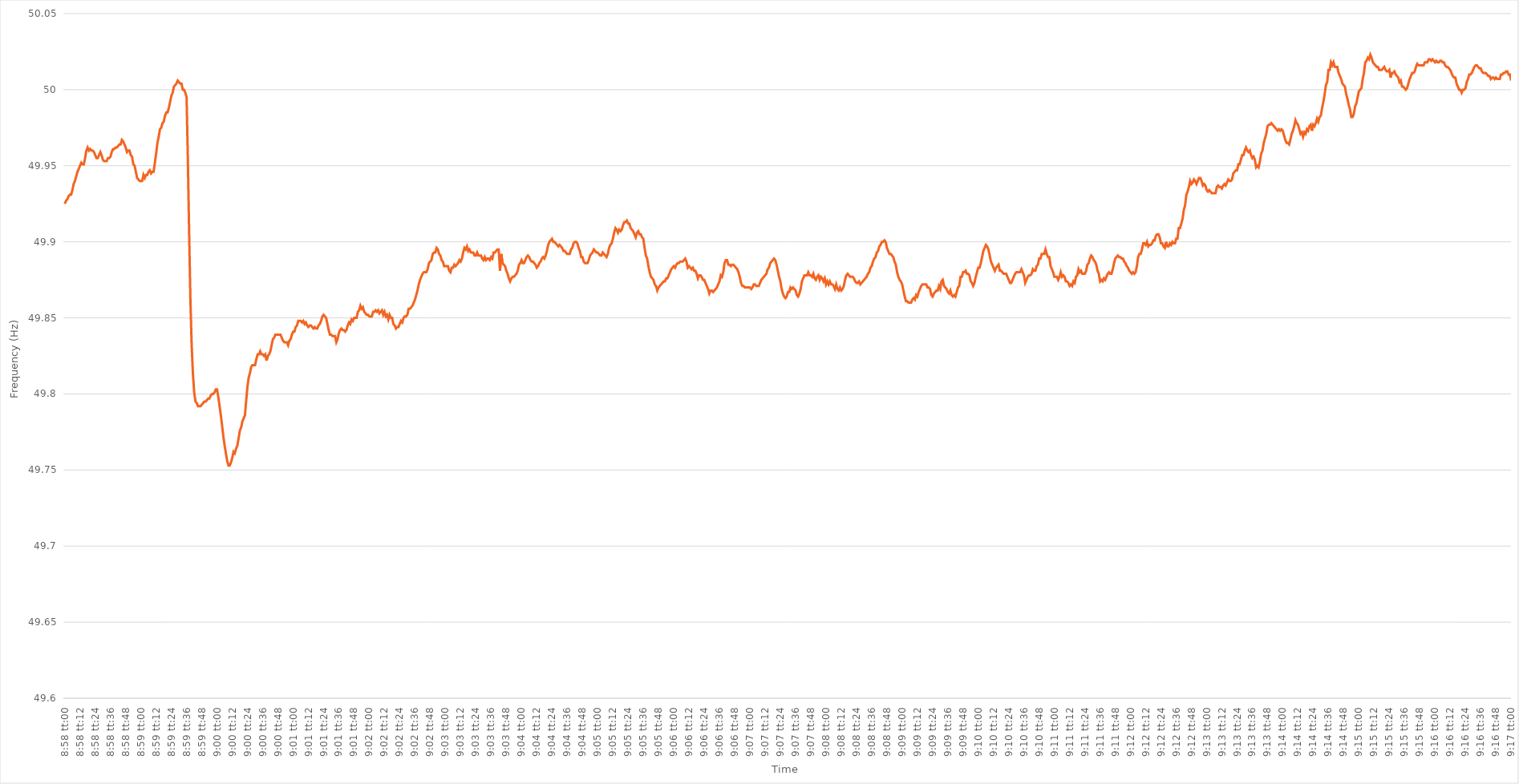
| Category | Series 0 |
|---|---|
| 0.3736111111111111 | 49.925 |
| 0.37362268518518515 | 49.927 |
| 0.37363425925925925 | 49.928 |
| 0.3736458333333333 | 49.93 |
| 0.37365740740740744 | 49.931 |
| 0.3736689814814815 | 49.931 |
| 0.37368055555555557 | 49.934 |
| 0.3736921296296296 | 49.938 |
| 0.3737037037037037 | 49.94 |
| 0.37371527777777774 | 49.943 |
| 0.3737268518518519 | 49.946 |
| 0.37373842592592593 | 49.948 |
| 0.37375 | 49.95 |
| 0.37376157407407407 | 49.952 |
| 0.37377314814814816 | 49.951 |
| 0.3737847222222222 | 49.951 |
| 0.37379629629629635 | 49.955 |
| 0.3738078703703704 | 49.96 |
| 0.3738194444444444 | 49.962 |
| 0.3738310185185185 | 49.96 |
| 0.37384259259259256 | 49.961 |
| 0.37385416666666665 | 49.96 |
| 0.3738657407407407 | 49.96 |
| 0.37387731481481484 | 49.959 |
| 0.3738888888888889 | 49.957 |
| 0.373900462962963 | 49.955 |
| 0.373912037037037 | 49.955 |
| 0.3739236111111111 | 49.957 |
| 0.37393518518518515 | 49.959 |
| 0.3739467592592593 | 49.957 |
| 0.37395833333333334 | 49.954 |
| 0.37396990740740743 | 49.953 |
| 0.37398148148148147 | 49.953 |
| 0.37399305555555556 | 49.953 |
| 0.3740046296296296 | 49.955 |
| 0.37401620370370375 | 49.955 |
| 0.3740277777777778 | 49.956 |
| 0.3740393518518519 | 49.959 |
| 0.3740509259259259 | 49.961 |
| 0.37406249999999996 | 49.961 |
| 0.37407407407407406 | 49.962 |
| 0.3740856481481481 | 49.962 |
| 0.37409722222222225 | 49.963 |
| 0.3741087962962963 | 49.964 |
| 0.3741203703703704 | 49.964 |
| 0.3741319444444444 | 49.967 |
| 0.3741435185185185 | 49.966 |
| 0.37415509259259255 | 49.964 |
| 0.3741666666666667 | 49.962 |
| 0.37417824074074074 | 49.959 |
| 0.37418981481481484 | 49.96 |
| 0.3742013888888889 | 49.96 |
| 0.37421296296296297 | 49.957 |
| 0.374224537037037 | 49.956 |
| 0.37423611111111116 | 49.951 |
| 0.3742476851851852 | 49.95 |
| 0.3742592592592593 | 49.946 |
| 0.37427083333333333 | 49.942 |
| 0.3742824074074074 | 49.941 |
| 0.37429398148148146 | 49.94 |
| 0.3743055555555555 | 49.94 |
| 0.37431712962962965 | 49.94 |
| 0.3743287037037037 | 49.944 |
| 0.3743402777777778 | 49.942 |
| 0.3743518518518518 | 49.944 |
| 0.3743634259259259 | 49.944 |
| 0.37437499999999996 | 49.946 |
| 0.3743865740740741 | 49.947 |
| 0.37439814814814815 | 49.945 |
| 0.37440972222222224 | 49.946 |
| 0.3744212962962963 | 49.946 |
| 0.3744328703703704 | 49.952 |
| 0.3744444444444444 | 49.958 |
| 0.37445601851851856 | 49.965 |
| 0.3744675925925926 | 49.969 |
| 0.3744791666666667 | 49.974 |
| 0.37449074074074074 | 49.975 |
| 0.37450231481481483 | 49.978 |
| 0.37451388888888887 | 49.979 |
| 0.374525462962963 | 49.983 |
| 0.37453703703703706 | 49.985 |
| 0.3745486111111111 | 49.985 |
| 0.3745601851851852 | 49.988 |
| 0.37457175925925923 | 49.992 |
| 0.3745833333333333 | 49.996 |
| 0.37459490740740736 | 49.998 |
| 0.3746064814814815 | 50.002 |
| 0.37461805555555555 | 50.003 |
| 0.37462962962962965 | 50.004 |
| 0.3746412037037037 | 50.006 |
| 0.3746527777777778 | 50.005 |
| 0.3746643518518518 | 50.004 |
| 0.37467592592592597 | 50.004 |
| 0.3746875 | 50 |
| 0.3746990740740741 | 50 |
| 0.37471064814814814 | 49.998 |
| 0.37472222222222223 | 49.995 |
| 0.3747337962962963 | 49.954 |
| 0.3747453703703704 | 49.906 |
| 0.37475694444444446 | 49.862 |
| 0.3747685185185185 | 49.832 |
| 0.3747800925925926 | 49.813 |
| 0.37479166666666663 | 49.801 |
| 0.37480324074074073 | 49.795 |
| 0.37481481481481477 | 49.794 |
| 0.3748263888888889 | 49.792 |
| 0.37483796296296296 | 49.792 |
| 0.37484953703703705 | 49.792 |
| 0.3748611111111111 | 49.793 |
| 0.3748726851851852 | 49.794 |
| 0.3748842592592592 | 49.795 |
| 0.3748958333333334 | 49.795 |
| 0.3749074074074074 | 49.796 |
| 0.3749189814814815 | 49.797 |
| 0.37493055555555554 | 49.797 |
| 0.37494212962962964 | 49.799 |
| 0.3749537037037037 | 49.8 |
| 0.37496527777777783 | 49.8 |
| 0.37497685185185187 | 49.801 |
| 0.37498842592592596 | 49.803 |
| 0.375 | 49.803 |
| 0.37501157407407404 | 49.798 |
| 0.37502314814814813 | 49.792 |
| 0.37503472222222217 | 49.786 |
| 0.3750462962962963 | 49.779 |
| 0.37505787037037036 | 49.772 |
| 0.37506944444444446 | 49.766 |
| 0.3750810185185185 | 49.761 |
| 0.3750925925925926 | 49.756 |
| 0.3751041666666666 | 49.753 |
| 0.3751157407407408 | 49.753 |
| 0.3751273148148148 | 49.755 |
| 0.3751388888888889 | 49.758 |
| 0.37515046296296295 | 49.762 |
| 0.37516203703703704 | 49.761 |
| 0.3751736111111111 | 49.764 |
| 0.37518518518518523 | 49.766 |
| 0.37519675925925927 | 49.771 |
| 0.37520833333333337 | 49.776 |
| 0.3752199074074074 | 49.778 |
| 0.3752314814814815 | 49.782 |
| 0.37524305555555554 | 49.784 |
| 0.3752546296296296 | 49.786 |
| 0.3752662037037037 | 49.796 |
| 0.37527777777777777 | 49.805 |
| 0.37528935185185186 | 49.811 |
| 0.3753009259259259 | 49.814 |
| 0.3753125 | 49.818 |
| 0.37532407407407403 | 49.819 |
| 0.3753356481481482 | 49.819 |
| 0.3753472222222222 | 49.819 |
| 0.3753587962962963 | 49.823 |
| 0.37537037037037035 | 49.826 |
| 0.37538194444444445 | 49.826 |
| 0.3753935185185185 | 49.828 |
| 0.37540509259259264 | 49.826 |
| 0.3754166666666667 | 49.826 |
| 0.37542824074074077 | 49.825 |
| 0.3754398148148148 | 49.826 |
| 0.3754513888888889 | 49.822 |
| 0.37546296296296294 | 49.825 |
| 0.375474537037037 | 49.826 |
| 0.37548611111111113 | 49.828 |
| 0.37549768518518517 | 49.832 |
| 0.37550925925925926 | 49.836 |
| 0.3755208333333333 | 49.837 |
| 0.3755324074074074 | 49.839 |
| 0.37554398148148144 | 49.839 |
| 0.3755555555555556 | 49.839 |
| 0.3755671296296296 | 49.839 |
| 0.3755787037037037 | 49.839 |
| 0.37559027777777776 | 49.837 |
| 0.37560185185185185 | 49.835 |
| 0.3756134259259259 | 49.834 |
| 0.37562500000000004 | 49.834 |
| 0.3756365740740741 | 49.834 |
| 0.3756481481481482 | 49.832 |
| 0.3756597222222222 | 49.835 |
| 0.3756712962962963 | 49.836 |
| 0.37568287037037035 | 49.839 |
| 0.3756944444444445 | 49.841 |
| 0.37570601851851854 | 49.841 |
| 0.3757175925925926 | 49.844 |
| 0.37572916666666667 | 49.845 |
| 0.3757407407407407 | 49.848 |
| 0.3757523148148148 | 49.848 |
| 0.37576388888888884 | 49.848 |
| 0.375775462962963 | 49.847 |
| 0.37578703703703703 | 49.848 |
| 0.3757986111111111 | 49.846 |
| 0.37581018518518516 | 49.847 |
| 0.37582175925925926 | 49.845 |
| 0.3758333333333333 | 49.844 |
| 0.37584490740740745 | 49.845 |
| 0.3758564814814815 | 49.845 |
| 0.3758680555555556 | 49.844 |
| 0.3758796296296296 | 49.843 |
| 0.3758912037037037 | 49.844 |
| 0.37590277777777775 | 49.843 |
| 0.3759143518518519 | 49.843 |
| 0.37592592592592594 | 49.845 |
| 0.37593750000000004 | 49.846 |
| 0.3759490740740741 | 49.848 |
| 0.3759606481481481 | 49.851 |
| 0.3759722222222222 | 49.852 |
| 0.37598379629629625 | 49.851 |
| 0.3759953703703704 | 49.85 |
| 0.37600694444444444 | 49.846 |
| 0.37601851851851853 | 49.842 |
| 0.37603009259259257 | 49.839 |
| 0.37604166666666666 | 49.839 |
| 0.3760532407407407 | 49.838 |
| 0.37606481481481485 | 49.838 |
| 0.3760763888888889 | 49.838 |
| 0.376087962962963 | 49.834 |
| 0.376099537037037 | 49.836 |
| 0.3761111111111111 | 49.84 |
| 0.37612268518518516 | 49.842 |
| 0.3761342592592593 | 49.843 |
| 0.37614583333333335 | 49.842 |
| 0.37615740740740744 | 49.842 |
| 0.3761689814814815 | 49.841 |
| 0.3761805555555556 | 49.842 |
| 0.3761921296296296 | 49.845 |
| 0.37620370370370365 | 49.847 |
| 0.3762152777777778 | 49.846 |
| 0.37622685185185184 | 49.849 |
| 0.37623842592592593 | 49.848 |
| 0.37625 | 49.85 |
| 0.37626157407407407 | 49.85 |
| 0.3762731481481481 | 49.85 |
| 0.37628472222222226 | 49.854 |
| 0.3762962962962963 | 49.855 |
| 0.3763078703703704 | 49.858 |
| 0.37631944444444443 | 49.856 |
| 0.3763310185185185 | 49.857 |
| 0.37634259259259256 | 49.854 |
| 0.3763541666666667 | 49.853 |
| 0.37636574074074075 | 49.852 |
| 0.37637731481481485 | 49.852 |
| 0.3763888888888889 | 49.851 |
| 0.376400462962963 | 49.851 |
| 0.376412037037037 | 49.851 |
| 0.37642361111111106 | 49.854 |
| 0.3764351851851852 | 49.854 |
| 0.37644675925925924 | 49.855 |
| 0.37645833333333334 | 49.854 |
| 0.3764699074074074 | 49.855 |
| 0.3764814814814815 | 49.853 |
| 0.3764930555555555 | 49.854 |
| 0.37650462962962966 | 49.855 |
| 0.3765162037037037 | 49.852 |
| 0.3765277777777778 | 49.854 |
| 0.37653935185185183 | 49.851 |
| 0.37655092592592593 | 49.852 |
| 0.37656249999999997 | 49.849 |
| 0.3765740740740741 | 49.852 |
| 0.37658564814814816 | 49.85 |
| 0.37659722222222225 | 49.85 |
| 0.3766087962962963 | 49.846 |
| 0.3766203703703704 | 49.845 |
| 0.3766319444444444 | 49.843 |
| 0.37664351851851857 | 49.844 |
| 0.3766550925925926 | 49.844 |
| 0.37666666666666665 | 49.846 |
| 0.37667824074074074 | 49.848 |
| 0.3766898148148148 | 49.847 |
| 0.3767013888888889 | 49.85 |
| 0.3767129629629629 | 49.851 |
| 0.37672453703703707 | 49.851 |
| 0.3767361111111111 | 49.852 |
| 0.3767476851851852 | 49.856 |
| 0.37675925925925924 | 49.856 |
| 0.37677083333333333 | 49.857 |
| 0.37678240740740737 | 49.858 |
| 0.3767939814814815 | 49.86 |
| 0.37680555555555556 | 49.862 |
| 0.37681712962962965 | 49.865 |
| 0.3768287037037037 | 49.868 |
| 0.3768402777777778 | 49.872 |
| 0.3768518518518518 | 49.875 |
| 0.376863425925926 | 49.877 |
| 0.376875 | 49.879 |
| 0.3768865740740741 | 49.88 |
| 0.37689814814814815 | 49.88 |
| 0.3769097222222222 | 49.88 |
| 0.3769212962962963 | 49.882 |
| 0.3769328703703703 | 49.886 |
| 0.37694444444444447 | 49.887 |
| 0.3769560185185185 | 49.888 |
| 0.3769675925925926 | 49.892 |
| 0.37697916666666664 | 49.893 |
| 0.37699074074074074 | 49.893 |
| 0.3770023148148148 | 49.896 |
| 0.3770138888888889 | 49.895 |
| 0.37702546296296297 | 49.892 |
| 0.37703703703703706 | 49.891 |
| 0.3770486111111111 | 49.888 |
| 0.3770601851851852 | 49.887 |
| 0.37707175925925923 | 49.884 |
| 0.3770833333333334 | 49.884 |
| 0.3770949074074074 | 49.884 |
| 0.3771064814814815 | 49.884 |
| 0.37711805555555555 | 49.881 |
| 0.37712962962962965 | 49.88 |
| 0.3771412037037037 | 49.883 |
| 0.3771527777777777 | 49.883 |
| 0.3771643518518519 | 49.885 |
| 0.3771759259259259 | 49.884 |
| 0.3771875 | 49.885 |
| 0.37719907407407405 | 49.886 |
| 0.37721064814814814 | 49.888 |
| 0.3772222222222222 | 49.887 |
| 0.37723379629629633 | 49.889 |
| 0.37724537037037037 | 49.893 |
| 0.37725694444444446 | 49.896 |
| 0.3772685185185185 | 49.895 |
| 0.3772800925925926 | 49.897 |
| 0.37729166666666664 | 49.894 |
| 0.3773032407407408 | 49.895 |
| 0.3773148148148148 | 49.893 |
| 0.3773263888888889 | 49.893 |
| 0.37733796296296296 | 49.893 |
| 0.37734953703703705 | 49.891 |
| 0.3773611111111111 | 49.891 |
| 0.37737268518518513 | 49.893 |
| 0.3773842592592593 | 49.891 |
| 0.3773958333333333 | 49.891 |
| 0.3774074074074074 | 49.891 |
| 0.37741898148148145 | 49.889 |
| 0.37743055555555555 | 49.888 |
| 0.3774421296296296 | 49.89 |
| 0.37745370370370374 | 49.888 |
| 0.3774652777777778 | 49.889 |
| 0.37747685185185187 | 49.889 |
| 0.3774884259259259 | 49.888 |
| 0.3775 | 49.89 |
| 0.37751157407407404 | 49.889 |
| 0.3775231481481482 | 49.893 |
| 0.37753472222222223 | 49.893 |
| 0.3775462962962963 | 49.894 |
| 0.37755787037037036 | 49.895 |
| 0.37756944444444446 | 49.895 |
| 0.3775810185185185 | 49.881 |
| 0.37759259259259265 | 49.892 |
| 0.3776041666666667 | 49.886 |
| 0.3776157407407407 | 49.885 |
| 0.3776273148148148 | 49.884 |
| 0.37763888888888886 | 49.881 |
| 0.37765046296296295 | 49.879 |
| 0.377662037037037 | 49.876 |
| 0.37767361111111114 | 49.874 |
| 0.3776851851851852 | 49.876 |
| 0.3776967592592593 | 49.877 |
| 0.3777083333333333 | 49.877 |
| 0.3777199074074074 | 49.878 |
| 0.37773148148148145 | 49.879 |
| 0.3777430555555556 | 49.881 |
| 0.37775462962962963 | 49.885 |
| 0.37776620370370373 | 49.886 |
| 0.37777777777777777 | 49.888 |
| 0.37778935185185186 | 49.886 |
| 0.3778009259259259 | 49.886 |
| 0.37781250000000005 | 49.888 |
| 0.3778240740740741 | 49.89 |
| 0.3778356481481482 | 49.891 |
| 0.3778472222222222 | 49.89 |
| 0.37785879629629626 | 49.888 |
| 0.37787037037037036 | 49.887 |
| 0.3778819444444444 | 49.887 |
| 0.37789351851851855 | 49.886 |
| 0.3779050925925926 | 49.885 |
| 0.3779166666666667 | 49.883 |
| 0.3779282407407407 | 49.884 |
| 0.3779398148148148 | 49.886 |
| 0.37795138888888885 | 49.887 |
| 0.377962962962963 | 49.889 |
| 0.37797453703703704 | 49.89 |
| 0.37798611111111113 | 49.889 |
| 0.3779976851851852 | 49.891 |
| 0.37800925925925927 | 49.894 |
| 0.3780208333333333 | 49.898 |
| 0.37803240740740746 | 49.9 |
| 0.3780439814814815 | 49.901 |
| 0.3780555555555556 | 49.902 |
| 0.37806712962962963 | 49.9 |
| 0.37807870370370367 | 49.9 |
| 0.37809027777777776 | 49.899 |
| 0.3781018518518518 | 49.898 |
| 0.37811342592592595 | 49.897 |
| 0.378125 | 49.898 |
| 0.3781365740740741 | 49.897 |
| 0.3781481481481481 | 49.896 |
| 0.3781597222222222 | 49.894 |
| 0.37817129629629626 | 49.894 |
| 0.3781828703703704 | 49.893 |
| 0.37819444444444444 | 49.892 |
| 0.37820601851851854 | 49.892 |
| 0.3782175925925926 | 49.892 |
| 0.37822916666666667 | 49.895 |
| 0.3782407407407407 | 49.896 |
| 0.37825231481481486 | 49.899 |
| 0.3782638888888889 | 49.9 |
| 0.378275462962963 | 49.9 |
| 0.37828703703703703 | 49.899 |
| 0.3782986111111111 | 49.896 |
| 0.37831018518518517 | 49.894 |
| 0.3783217592592592 | 49.89 |
| 0.37833333333333335 | 49.89 |
| 0.3783449074074074 | 49.887 |
| 0.3783564814814815 | 49.886 |
| 0.3783680555555555 | 49.886 |
| 0.3783796296296296 | 49.886 |
| 0.37839120370370366 | 49.888 |
| 0.3784027777777778 | 49.891 |
| 0.37841435185185185 | 49.892 |
| 0.37842592592592594 | 49.893 |
| 0.3784375 | 49.895 |
| 0.3784490740740741 | 49.894 |
| 0.3784606481481481 | 49.893 |
| 0.37847222222222227 | 49.893 |
| 0.3784837962962963 | 49.892 |
| 0.3784953703703704 | 49.891 |
| 0.37850694444444444 | 49.891 |
| 0.37851851851851853 | 49.893 |
| 0.37853009259259257 | 49.892 |
| 0.3785416666666667 | 49.891 |
| 0.37855324074074076 | 49.89 |
| 0.3785648148148148 | 49.892 |
| 0.3785763888888889 | 49.896 |
| 0.37858796296296293 | 49.898 |
| 0.378599537037037 | 49.899 |
| 0.37861111111111106 | 49.902 |
| 0.3786226851851852 | 49.906 |
| 0.37863425925925925 | 49.909 |
| 0.37864583333333335 | 49.908 |
| 0.3786574074074074 | 49.906 |
| 0.3786689814814815 | 49.908 |
| 0.3786805555555555 | 49.907 |
| 0.37869212962962967 | 49.908 |
| 0.3787037037037037 | 49.911 |
| 0.3787152777777778 | 49.913 |
| 0.37872685185185184 | 49.913 |
| 0.37873842592592594 | 49.914 |
| 0.37875 | 49.912 |
| 0.3787615740740741 | 49.912 |
| 0.37877314814814816 | 49.909 |
| 0.37878472222222226 | 49.908 |
| 0.3787962962962963 | 49.907 |
| 0.37880787037037034 | 49.905 |
| 0.37881944444444443 | 49.903 |
| 0.37883101851851847 | 49.906 |
| 0.3788425925925926 | 49.907 |
| 0.37885416666666666 | 49.905 |
| 0.37886574074074075 | 49.905 |
| 0.3788773148148148 | 49.903 |
| 0.3788888888888889 | 49.902 |
| 0.3789004629629629 | 49.896 |
| 0.3789120370370371 | 49.891 |
| 0.3789236111111111 | 49.889 |
| 0.3789351851851852 | 49.884 |
| 0.37894675925925925 | 49.88 |
| 0.37895833333333334 | 49.877 |
| 0.3789699074074074 | 49.876 |
| 0.37898148148148153 | 49.875 |
| 0.37899305555555557 | 49.872 |
| 0.37900462962962966 | 49.871 |
| 0.3790162037037037 | 49.868 |
| 0.37902777777777774 | 49.87 |
| 0.37903935185185184 | 49.871 |
| 0.3790509259259259 | 49.872 |
| 0.3790625 | 49.873 |
| 0.37907407407407406 | 49.874 |
| 0.37908564814814816 | 49.874 |
| 0.3790972222222222 | 49.876 |
| 0.3791087962962963 | 49.876 |
| 0.37912037037037033 | 49.878 |
| 0.3791319444444445 | 49.88 |
| 0.3791435185185185 | 49.882 |
| 0.3791550925925926 | 49.883 |
| 0.37916666666666665 | 49.884 |
| 0.37917824074074075 | 49.883 |
| 0.3791898148148148 | 49.885 |
| 0.37920138888888894 | 49.886 |
| 0.379212962962963 | 49.886 |
| 0.37922453703703707 | 49.887 |
| 0.3792361111111111 | 49.887 |
| 0.3792476851851852 | 49.887 |
| 0.37925925925925924 | 49.888 |
| 0.3792708333333333 | 49.889 |
| 0.37928240740740743 | 49.887 |
| 0.37929398148148147 | 49.883 |
| 0.37930555555555556 | 49.884 |
| 0.3793171296296296 | 49.883 |
| 0.3793287037037037 | 49.882 |
| 0.37934027777777773 | 49.883 |
| 0.3793518518518519 | 49.881 |
| 0.3793634259259259 | 49.881 |
| 0.379375 | 49.879 |
| 0.37938657407407406 | 49.876 |
| 0.37939814814814815 | 49.878 |
| 0.3794097222222222 | 49.878 |
| 0.37942129629629634 | 49.877 |
| 0.3794328703703704 | 49.875 |
| 0.3794444444444445 | 49.875 |
| 0.3794560185185185 | 49.873 |
| 0.3794675925925926 | 49.871 |
| 0.37947916666666665 | 49.869 |
| 0.3794907407407408 | 49.866 |
| 0.37950231481481483 | 49.868 |
| 0.3795138888888889 | 49.868 |
| 0.37952546296296297 | 49.867 |
| 0.379537037037037 | 49.868 |
| 0.3795486111111111 | 49.869 |
| 0.37956018518518514 | 49.87 |
| 0.3795717592592593 | 49.872 |
| 0.37958333333333333 | 49.874 |
| 0.3795949074074074 | 49.878 |
| 0.37960648148148146 | 49.877 |
| 0.37961805555555556 | 49.88 |
| 0.3796296296296296 | 49.886 |
| 0.37964120370370374 | 49.888 |
| 0.3796527777777778 | 49.888 |
| 0.3796643518518519 | 49.885 |
| 0.3796759259259259 | 49.885 |
| 0.3796875 | 49.884 |
| 0.37969907407407405 | 49.885 |
| 0.3797106481481482 | 49.885 |
| 0.37972222222222224 | 49.884 |
| 0.37973379629629633 | 49.883 |
| 0.37974537037037037 | 49.882 |
| 0.3797569444444444 | 49.88 |
| 0.3797685185185185 | 49.877 |
| 0.37978009259259254 | 49.873 |
| 0.3797916666666667 | 49.871 |
| 0.37980324074074073 | 49.871 |
| 0.3798148148148148 | 49.87 |
| 0.37982638888888887 | 49.87 |
| 0.37983796296296296 | 49.87 |
| 0.379849537037037 | 49.87 |
| 0.37986111111111115 | 49.87 |
| 0.3798726851851852 | 49.869 |
| 0.3798842592592593 | 49.87 |
| 0.3798958333333333 | 49.872 |
| 0.3799074074074074 | 49.872 |
| 0.37991898148148145 | 49.871 |
| 0.3799305555555556 | 49.871 |
| 0.37994212962962964 | 49.871 |
| 0.37995370370370374 | 49.873 |
| 0.3799652777777778 | 49.875 |
| 0.3799768518518518 | 49.876 |
| 0.3799884259259259 | 49.877 |
| 0.37999999999999995 | 49.878 |
| 0.3800115740740741 | 49.879 |
| 0.38002314814814814 | 49.882 |
| 0.38003472222222223 | 49.883 |
| 0.38004629629629627 | 49.886 |
| 0.38005787037037037 | 49.887 |
| 0.3800694444444444 | 49.888 |
| 0.38008101851851855 | 49.889 |
| 0.3800925925925926 | 49.888 |
| 0.3801041666666667 | 49.885 |
| 0.3801157407407407 | 49.881 |
| 0.3801273148148148 | 49.877 |
| 0.38013888888888886 | 49.874 |
| 0.380150462962963 | 49.869 |
| 0.38016203703703705 | 49.866 |
| 0.38017361111111114 | 49.864 |
| 0.3801851851851852 | 49.863 |
| 0.3801967592592593 | 49.864 |
| 0.3802083333333333 | 49.867 |
| 0.38021990740740735 | 49.867 |
| 0.3802314814814815 | 49.87 |
| 0.38024305555555554 | 49.869 |
| 0.38025462962962964 | 49.87 |
| 0.3802662037037037 | 49.869 |
| 0.38027777777777777 | 49.868 |
| 0.3802893518518518 | 49.865 |
| 0.38030092592592596 | 49.864 |
| 0.3803125 | 49.866 |
| 0.3803240740740741 | 49.869 |
| 0.38033564814814813 | 49.874 |
| 0.3803472222222222 | 49.876 |
| 0.38035879629629626 | 49.878 |
| 0.3803703703703704 | 49.878 |
| 0.38038194444444445 | 49.878 |
| 0.38039351851851855 | 49.88 |
| 0.3804050925925926 | 49.878 |
| 0.3804166666666667 | 49.878 |
| 0.3804282407407407 | 49.877 |
| 0.38043981481481487 | 49.879 |
| 0.3804513888888889 | 49.876 |
| 0.38046296296296295 | 49.875 |
| 0.38047453703703704 | 49.877 |
| 0.3804861111111111 | 49.878 |
| 0.3804976851851852 | 49.875 |
| 0.3805092592592592 | 49.877 |
| 0.38052083333333336 | 49.876 |
| 0.3805324074074074 | 49.874 |
| 0.3805439814814815 | 49.876 |
| 0.38055555555555554 | 49.872 |
| 0.38056712962962963 | 49.874 |
| 0.38057870370370367 | 49.872 |
| 0.3805902777777778 | 49.874 |
| 0.38060185185185186 | 49.872 |
| 0.38061342592592595 | 49.872 |
| 0.380625 | 49.871 |
| 0.3806365740740741 | 49.869 |
| 0.3806481481481481 | 49.872 |
| 0.3806597222222223 | 49.869 |
| 0.3806712962962963 | 49.868 |
| 0.38068287037037035 | 49.87 |
| 0.38069444444444445 | 49.868 |
| 0.3807060185185185 | 49.869 |
| 0.3807175925925926 | 49.871 |
| 0.3807291666666666 | 49.875 |
| 0.38074074074074077 | 49.878 |
| 0.3807523148148148 | 49.879 |
| 0.3807638888888889 | 49.878 |
| 0.38077546296296294 | 49.877 |
| 0.38078703703703703 | 49.877 |
| 0.3807986111111111 | 49.877 |
| 0.3808101851851852 | 49.876 |
| 0.38082175925925926 | 49.874 |
| 0.38083333333333336 | 49.873 |
| 0.3808449074074074 | 49.873 |
| 0.3808564814814815 | 49.874 |
| 0.38086805555555553 | 49.872 |
| 0.3808796296296297 | 49.873 |
| 0.3808912037037037 | 49.874 |
| 0.3809027777777778 | 49.875 |
| 0.38091435185185185 | 49.876 |
| 0.3809259259259259 | 49.877 |
| 0.3809375 | 49.879 |
| 0.380949074074074 | 49.88 |
| 0.3809606481481482 | 49.883 |
| 0.3809722222222222 | 49.884 |
| 0.3809837962962963 | 49.887 |
| 0.38099537037037035 | 49.889 |
| 0.38100694444444444 | 49.89 |
| 0.3810185185185185 | 49.893 |
| 0.38103009259259263 | 49.894 |
| 0.38104166666666667 | 49.897 |
| 0.38105324074074076 | 49.898 |
| 0.3810648148148148 | 49.9 |
| 0.3810763888888889 | 49.9 |
| 0.38108796296296293 | 49.901 |
| 0.3810995370370371 | 49.9 |
| 0.3811111111111111 | 49.896 |
| 0.3811226851851852 | 49.894 |
| 0.38113425925925926 | 49.892 |
| 0.38114583333333335 | 49.892 |
| 0.3811574074074074 | 49.891 |
| 0.38116898148148143 | 49.89 |
| 0.3811805555555556 | 49.887 |
| 0.3811921296296296 | 49.885 |
| 0.3812037037037037 | 49.88 |
| 0.38121527777777775 | 49.877 |
| 0.38122685185185184 | 49.875 |
| 0.3812384259259259 | 49.874 |
| 0.38125000000000003 | 49.872 |
| 0.38126157407407407 | 49.868 |
| 0.38127314814814817 | 49.864 |
| 0.3812847222222222 | 49.861 |
| 0.3812962962962963 | 49.861 |
| 0.38130787037037034 | 49.86 |
| 0.3813194444444445 | 49.86 |
| 0.3813310185185185 | 49.86 |
| 0.3813425925925926 | 49.862 |
| 0.38135416666666666 | 49.863 |
| 0.38136574074074076 | 49.862 |
| 0.3813773148148148 | 49.865 |
| 0.38138888888888883 | 49.864 |
| 0.381400462962963 | 49.867 |
| 0.381412037037037 | 49.869 |
| 0.3814236111111111 | 49.871 |
| 0.38143518518518515 | 49.872 |
| 0.38144675925925925 | 49.872 |
| 0.3814583333333333 | 49.872 |
| 0.38146990740740744 | 49.872 |
| 0.3814814814814815 | 49.87 |
| 0.38149305555555557 | 49.87 |
| 0.3815046296296296 | 49.869 |
| 0.3815162037037037 | 49.865 |
| 0.38152777777777774 | 49.864 |
| 0.3815393518518519 | 49.866 |
| 0.38155092592592593 | 49.867 |
| 0.3815625 | 49.868 |
| 0.38157407407407407 | 49.868 |
| 0.38158564814814816 | 49.871 |
| 0.3815972222222222 | 49.869 |
| 0.38160879629629635 | 49.874 |
| 0.3816203703703704 | 49.875 |
| 0.3816319444444445 | 49.871 |
| 0.3816435185185185 | 49.87 |
| 0.38165509259259256 | 49.869 |
| 0.38166666666666665 | 49.867 |
| 0.3816782407407407 | 49.866 |
| 0.38168981481481484 | 49.868 |
| 0.3817013888888889 | 49.865 |
| 0.381712962962963 | 49.864 |
| 0.381724537037037 | 49.865 |
| 0.3817361111111111 | 49.864 |
| 0.38174768518518515 | 49.867 |
| 0.3817592592592593 | 49.87 |
| 0.38177083333333334 | 49.871 |
| 0.38178240740740743 | 49.877 |
| 0.38179398148148147 | 49.877 |
| 0.38180555555555556 | 49.88 |
| 0.3818171296296296 | 49.88 |
| 0.38182870370370375 | 49.881 |
| 0.3818402777777778 | 49.879 |
| 0.3818518518518519 | 49.879 |
| 0.3818634259259259 | 49.878 |
| 0.38187499999999996 | 49.874 |
| 0.38188657407407406 | 49.873 |
| 0.3818981481481481 | 49.871 |
| 0.38190972222222225 | 49.873 |
| 0.3819212962962963 | 49.877 |
| 0.3819328703703704 | 49.88 |
| 0.3819444444444444 | 49.883 |
| 0.3819560185185185 | 49.883 |
| 0.38196759259259255 | 49.886 |
| 0.3819791666666667 | 49.89 |
| 0.38199074074074074 | 49.894 |
| 0.38200231481481484 | 49.896 |
| 0.3820138888888889 | 49.898 |
| 0.38202546296296297 | 49.897 |
| 0.382037037037037 | 49.895 |
| 0.38204861111111116 | 49.891 |
| 0.3820601851851852 | 49.887 |
| 0.3820717592592593 | 49.885 |
| 0.38208333333333333 | 49.883 |
| 0.3820949074074074 | 49.881 |
| 0.38210648148148146 | 49.883 |
| 0.3821180555555555 | 49.884 |
| 0.38212962962962965 | 49.885 |
| 0.3821412037037037 | 49.881 |
| 0.3821527777777778 | 49.881 |
| 0.3821643518518518 | 49.88 |
| 0.3821759259259259 | 49.879 |
| 0.38218749999999996 | 49.879 |
| 0.3821990740740741 | 49.879 |
| 0.38221064814814815 | 49.877 |
| 0.38222222222222224 | 49.875 |
| 0.3822337962962963 | 49.873 |
| 0.3822453703703704 | 49.873 |
| 0.3822569444444444 | 49.875 |
| 0.38226851851851856 | 49.877 |
| 0.3822800925925926 | 49.879 |
| 0.3822916666666667 | 49.88 |
| 0.38230324074074074 | 49.88 |
| 0.38231481481481483 | 49.88 |
| 0.38232638888888887 | 49.88 |
| 0.382337962962963 | 49.882 |
| 0.38234953703703706 | 49.88 |
| 0.3823611111111111 | 49.878 |
| 0.3823726851851852 | 49.873 |
| 0.38238425925925923 | 49.875 |
| 0.3823958333333333 | 49.877 |
| 0.38240740740740736 | 49.878 |
| 0.3824189814814815 | 49.878 |
| 0.38243055555555555 | 49.879 |
| 0.38244212962962965 | 49.882 |
| 0.3824537037037037 | 49.881 |
| 0.3824652777777778 | 49.881 |
| 0.3824768518518518 | 49.884 |
| 0.38248842592592597 | 49.885 |
| 0.3825 | 49.889 |
| 0.3825115740740741 | 49.889 |
| 0.38252314814814814 | 49.892 |
| 0.38253472222222223 | 49.892 |
| 0.3825462962962963 | 49.892 |
| 0.3825578703703704 | 49.895 |
| 0.38256944444444446 | 49.892 |
| 0.3825810185185185 | 49.89 |
| 0.3825925925925926 | 49.89 |
| 0.38260416666666663 | 49.884 |
| 0.38261574074074073 | 49.882 |
| 0.38262731481481477 | 49.88 |
| 0.3826388888888889 | 49.877 |
| 0.38265046296296296 | 49.877 |
| 0.38266203703703705 | 49.877 |
| 0.3826736111111111 | 49.875 |
| 0.3826851851851852 | 49.877 |
| 0.3826967592592592 | 49.88 |
| 0.3827083333333334 | 49.877 |
| 0.3827199074074074 | 49.878 |
| 0.3827314814814815 | 49.877 |
| 0.38274305555555554 | 49.874 |
| 0.38275462962962964 | 49.874 |
| 0.3827662037037037 | 49.873 |
| 0.38277777777777783 | 49.871 |
| 0.38278935185185187 | 49.872 |
| 0.38280092592592596 | 49.871 |
| 0.3828125 | 49.874 |
| 0.38282407407407404 | 49.873 |
| 0.38283564814814813 | 49.877 |
| 0.38284722222222217 | 49.878 |
| 0.3828587962962963 | 49.882 |
| 0.38287037037037036 | 49.88 |
| 0.38288194444444446 | 49.881 |
| 0.3828935185185185 | 49.879 |
| 0.3829050925925926 | 49.879 |
| 0.3829166666666666 | 49.879 |
| 0.3829282407407408 | 49.881 |
| 0.3829398148148148 | 49.885 |
| 0.3829513888888889 | 49.886 |
| 0.38296296296296295 | 49.889 |
| 0.38297453703703704 | 49.891 |
| 0.3829861111111111 | 49.89 |
| 0.38299768518518523 | 49.888 |
| 0.38300925925925927 | 49.887 |
| 0.38302083333333337 | 49.885 |
| 0.3830324074074074 | 49.881 |
| 0.3830439814814815 | 49.879 |
| 0.38305555555555554 | 49.874 |
| 0.3830671296296296 | 49.875 |
| 0.3830787037037037 | 49.874 |
| 0.38309027777777777 | 49.876 |
| 0.38310185185185186 | 49.875 |
| 0.3831134259259259 | 49.877 |
| 0.383125 | 49.879 |
| 0.38313657407407403 | 49.88 |
| 0.3831481481481482 | 49.879 |
| 0.3831597222222222 | 49.879 |
| 0.3831712962962963 | 49.882 |
| 0.38318287037037035 | 49.886 |
| 0.38319444444444445 | 49.889 |
| 0.3832060185185185 | 49.89 |
| 0.38321759259259264 | 49.891 |
| 0.3832291666666667 | 49.89 |
| 0.38324074074074077 | 49.89 |
| 0.3832523148148148 | 49.889 |
| 0.3832638888888889 | 49.889 |
| 0.38327546296296294 | 49.887 |
| 0.383287037037037 | 49.886 |
| 0.38329861111111113 | 49.884 |
| 0.38331018518518517 | 49.883 |
| 0.38332175925925926 | 49.881 |
| 0.3833333333333333 | 49.88 |
| 0.3833449074074074 | 49.879 |
| 0.38335648148148144 | 49.88 |
| 0.3833680555555556 | 49.879 |
| 0.3833796296296296 | 49.88 |
| 0.3833912037037037 | 49.884 |
| 0.38340277777777776 | 49.89 |
| 0.38341435185185185 | 49.892 |
| 0.3834259259259259 | 49.892 |
| 0.38343750000000004 | 49.895 |
| 0.3834490740740741 | 49.899 |
| 0.3834606481481482 | 49.899 |
| 0.3834722222222222 | 49.898 |
| 0.3834837962962963 | 49.9 |
| 0.38349537037037035 | 49.897 |
| 0.3835069444444445 | 49.898 |
| 0.38351851851851854 | 49.898 |
| 0.3835300925925926 | 49.899 |
| 0.38354166666666667 | 49.901 |
| 0.3835532407407407 | 49.901 |
| 0.3835648148148148 | 49.904 |
| 0.38357638888888884 | 49.905 |
| 0.383587962962963 | 49.905 |
| 0.38359953703703703 | 49.903 |
| 0.3836111111111111 | 49.899 |
| 0.38362268518518516 | 49.899 |
| 0.38363425925925926 | 49.897 |
| 0.3836458333333333 | 49.896 |
| 0.38365740740740745 | 49.9 |
| 0.3836689814814815 | 49.897 |
| 0.3836805555555556 | 49.897 |
| 0.3836921296296296 | 49.899 |
| 0.3837037037037037 | 49.898 |
| 0.38371527777777775 | 49.9 |
| 0.3837268518518519 | 49.899 |
| 0.38373842592592594 | 49.899 |
| 0.38375000000000004 | 49.902 |
| 0.3837615740740741 | 49.902 |
| 0.3837731481481481 | 49.909 |
| 0.3837847222222222 | 49.909 |
| 0.38379629629629625 | 49.912 |
| 0.3838078703703704 | 49.915 |
| 0.38381944444444444 | 49.921 |
| 0.38383101851851853 | 49.924 |
| 0.38384259259259257 | 49.931 |
| 0.38385416666666666 | 49.933 |
| 0.3838657407407407 | 49.936 |
| 0.38387731481481485 | 49.94 |
| 0.3838888888888889 | 49.938 |
| 0.383900462962963 | 49.939 |
| 0.383912037037037 | 49.941 |
| 0.3839236111111111 | 49.94 |
| 0.38393518518518516 | 49.938 |
| 0.3839467592592593 | 49.94 |
| 0.38395833333333335 | 49.942 |
| 0.38396990740740744 | 49.942 |
| 0.3839814814814815 | 49.94 |
| 0.3839930555555555 | 49.937 |
| 0.3840046296296296 | 49.938 |
| 0.38401620370370365 | 49.937 |
| 0.3840277777777778 | 49.934 |
| 0.38403935185185184 | 49.933 |
| 0.38405092592592593 | 49.934 |
| 0.3840625 | 49.933 |
| 0.38407407407407407 | 49.932 |
| 0.3840856481481481 | 49.932 |
| 0.38409722222222226 | 49.932 |
| 0.3841087962962963 | 49.932 |
| 0.3841203703703704 | 49.936 |
| 0.38413194444444443 | 49.937 |
| 0.3841435185185185 | 49.936 |
| 0.38415509259259256 | 49.936 |
| 0.3841666666666667 | 49.935 |
| 0.38417824074074075 | 49.937 |
| 0.38418981481481485 | 49.938 |
| 0.3842013888888889 | 49.937 |
| 0.384212962962963 | 49.939 |
| 0.384224537037037 | 49.941 |
| 0.38423611111111117 | 49.94 |
| 0.3842476851851852 | 49.94 |
| 0.38425925925925924 | 49.941 |
| 0.38427083333333334 | 49.945 |
| 0.3842824074074074 | 49.946 |
| 0.3842939814814815 | 49.947 |
| 0.3843055555555555 | 49.947 |
| 0.38431712962962966 | 49.951 |
| 0.3843287037037037 | 49.951 |
| 0.3843402777777778 | 49.954 |
| 0.38435185185185183 | 49.957 |
| 0.38436342592592593 | 49.957 |
| 0.38437499999999997 | 49.96 |
| 0.3843865740740741 | 49.962 |
| 0.38439814814814816 | 49.96 |
| 0.38440972222222225 | 49.959 |
| 0.3844212962962963 | 49.96 |
| 0.3844328703703704 | 49.957 |
| 0.3844444444444444 | 49.955 |
| 0.38445601851851857 | 49.956 |
| 0.3844675925925926 | 49.954 |
| 0.38447916666666665 | 49.949 |
| 0.38449074074074074 | 49.95 |
| 0.3845023148148148 | 49.949 |
| 0.3845138888888889 | 49.953 |
| 0.3845254629629629 | 49.958 |
| 0.38453703703703707 | 49.96 |
| 0.3845486111111111 | 49.965 |
| 0.3845601851851852 | 49.968 |
| 0.38457175925925924 | 49.971 |
| 0.38458333333333333 | 49.976 |
| 0.38459490740740737 | 49.977 |
| 0.3846064814814815 | 49.977 |
| 0.38461805555555556 | 49.978 |
| 0.38462962962962965 | 49.977 |
| 0.3846412037037037 | 49.976 |
| 0.3846527777777778 | 49.975 |
| 0.3846643518518518 | 49.974 |
| 0.384675925925926 | 49.973 |
| 0.3846875 | 49.974 |
| 0.3846990740740741 | 49.973 |
| 0.38471064814814815 | 49.974 |
| 0.3847222222222222 | 49.973 |
| 0.3847337962962963 | 49.97 |
| 0.3847453703703703 | 49.967 |
| 0.38475694444444447 | 49.965 |
| 0.3847685185185185 | 49.965 |
| 0.3847800925925926 | 49.964 |
| 0.38479166666666664 | 49.967 |
| 0.38480324074074074 | 49.971 |
| 0.3848148148148148 | 49.973 |
| 0.3848263888888889 | 49.976 |
| 0.38483796296296297 | 49.98 |
| 0.38484953703703706 | 49.978 |
| 0.3848611111111111 | 49.977 |
| 0.3848726851851852 | 49.974 |
| 0.38488425925925923 | 49.971 |
| 0.3848958333333334 | 49.972 |
| 0.3849074074074074 | 49.969 |
| 0.3849189814814815 | 49.972 |
| 0.38493055555555555 | 49.971 |
| 0.38494212962962965 | 49.974 |
| 0.3849537037037037 | 49.973 |
| 0.3849652777777777 | 49.976 |
| 0.3849768518518519 | 49.977 |
| 0.3849884259259259 | 49.973 |
| 0.385 | 49.977 |
| 0.38501157407407405 | 49.976 |
| 0.38502314814814814 | 49.978 |
| 0.3850347222222222 | 49.981 |
| 0.38504629629629633 | 49.979 |
| 0.38505787037037037 | 49.982 |
| 0.38506944444444446 | 49.983 |
| 0.3850810185185185 | 49.988 |
| 0.3850925925925926 | 49.992 |
| 0.38510416666666664 | 49.997 |
| 0.3851157407407408 | 50.003 |
| 0.3851273148148148 | 50.005 |
| 0.3851388888888889 | 50.013 |
| 0.38515046296296296 | 50.013 |
| 0.38516203703703705 | 50.018 |
| 0.3851736111111111 | 50.016 |
| 0.38518518518518513 | 50.018 |
| 0.3851967592592593 | 50.015 |
| 0.3852083333333333 | 50.015 |
| 0.3852199074074074 | 50.015 |
| 0.38523148148148145 | 50.011 |
| 0.38524305555555555 | 50.009 |
| 0.3852546296296296 | 50.007 |
| 0.38526620370370374 | 50.004 |
| 0.3852777777777778 | 50.003 |
| 0.38528935185185187 | 50.002 |
| 0.3853009259259259 | 49.997 |
| 0.3853125 | 49.994 |
| 0.38532407407407404 | 49.99 |
| 0.3853356481481482 | 49.987 |
| 0.38534722222222223 | 49.982 |
| 0.3853587962962963 | 49.982 |
| 0.38537037037037036 | 49.984 |
| 0.38538194444444446 | 49.989 |
| 0.3853935185185185 | 49.991 |
| 0.38540509259259265 | 49.995 |
| 0.3854166666666667 | 49.999 |
| 0.3854282407407407 | 50 |
| 0.3854398148148148 | 50.001 |
| 0.38545138888888886 | 50.007 |
| 0.38546296296296295 | 50.011 |
| 0.385474537037037 | 50.018 |
| 0.38548611111111114 | 50.019 |
| 0.3854976851851852 | 50.021 |
| 0.3855092592592593 | 50.02 |
| 0.3855208333333333 | 50.023 |
| 0.3855324074074074 | 50.021 |
| 0.38554398148148145 | 50.018 |
| 0.3855555555555556 | 50.017 |
| 0.38556712962962963 | 50.016 |
| 0.38557870370370373 | 50.015 |
| 0.38559027777777777 | 50.015 |
| 0.38560185185185186 | 50.013 |
| 0.3856134259259259 | 50.013 |
| 0.38562500000000005 | 50.013 |
| 0.3856365740740741 | 50.014 |
| 0.3856481481481482 | 50.015 |
| 0.3856597222222222 | 50.013 |
| 0.38567129629629626 | 50.012 |
| 0.38568287037037036 | 50.012 |
| 0.3856944444444444 | 50.013 |
| 0.38570601851851855 | 50.008 |
| 0.3857175925925926 | 50.011 |
| 0.3857291666666667 | 50.011 |
| 0.3857407407407407 | 50.012 |
| 0.3857523148148148 | 50.01 |
| 0.38576388888888885 | 50.009 |
| 0.385775462962963 | 50.008 |
| 0.38578703703703704 | 50.005 |
| 0.38579861111111113 | 50.006 |
| 0.3858101851851852 | 50.002 |
| 0.38582175925925927 | 50.002 |
| 0.3858333333333333 | 50.001 |
| 0.38584490740740746 | 50 |
| 0.3858564814814815 | 50.001 |
| 0.3858680555555556 | 50.004 |
| 0.38587962962962963 | 50.007 |
| 0.38589120370370367 | 50.009 |
| 0.38590277777777776 | 50.011 |
| 0.3859143518518518 | 50.011 |
| 0.38592592592592595 | 50.012 |
| 0.3859375 | 50.015 |
| 0.3859490740740741 | 50.017 |
| 0.3859606481481481 | 50.016 |
| 0.3859722222222222 | 50.016 |
| 0.38598379629629626 | 50.016 |
| 0.3859953703703704 | 50.016 |
| 0.38600694444444444 | 50.016 |
| 0.38601851851851854 | 50.018 |
| 0.3860300925925926 | 50.018 |
| 0.38604166666666667 | 50.018 |
| 0.3860532407407407 | 50.02 |
| 0.38606481481481486 | 50.02 |
| 0.3860763888888889 | 50.019 |
| 0.386087962962963 | 50.02 |
| 0.38609953703703703 | 50.019 |
| 0.3861111111111111 | 50.018 |
| 0.38612268518518517 | 50.019 |
| 0.3861342592592593 | 50.018 |
| 0.38614583333333335 | 50.018 |
| 0.3861574074074074 | 50.019 |
| 0.3861689814814815 | 50.019 |
| 0.3861805555555555 | 50.018 |
| 0.3861921296296296 | 50.018 |
| 0.38620370370370366 | 50.016 |
| 0.3862152777777778 | 50.015 |
| 0.38622685185185185 | 50.015 |
| 0.38623842592592594 | 50.014 |
| 0.38625 | 50.013 |
| 0.3862615740740741 | 50.011 |
| 0.3862731481481481 | 50.009 |
| 0.38628472222222227 | 50.008 |
| 0.3862962962962963 | 50.008 |
| 0.3863078703703704 | 50.004 |
| 0.38631944444444444 | 50.002 |
| 0.38633101851851853 | 50 |
| 0.38634259259259257 | 50 |
| 0.3863541666666667 | 49.998 |
| 0.38636574074074076 | 50 |
| 0.3863773148148148 | 50 |
| 0.3863888888888889 | 50.001 |
| 0.38640046296296293 | 50.005 |
| 0.386412037037037 | 50.007 |
| 0.38642361111111106 | 50.01 |
| 0.3864351851851852 | 50.01 |
| 0.38644675925925925 | 50.011 |
| 0.38645833333333335 | 50.013 |
| 0.3864699074074074 | 50.015 |
| 0.3864814814814815 | 50.016 |
| 0.3864930555555555 | 50.016 |
| 0.38650462962962967 | 50.015 |
| 0.3865162037037037 | 50.014 |
| 0.3865277777777778 | 50.014 |
| 0.38653935185185184 | 50.012 |
| 0.38655092592592594 | 50.011 |
| 0.3865625 | 50.011 |
| 0.3865740740740741 | 50.011 |
| 0.38658564814814816 | 50.01 |
| 0.3865972222222222 | 50.009 |
| 0.3866087962962963 | 50.009 |
| 0.38662037037037034 | 50.007 |
| 0.38663194444444443 | 50.008 |
| 0.38664351851851847 | 50.008 |
| 0.3866550925925926 | 50.007 |
| 0.38666666666666666 | 50.008 |
| 0.38667824074074075 | 50.007 |
| 0.3866898148148148 | 50.007 |
| 0.3867013888888889 | 50.007 |
| 0.3867129629629629 | 50.01 |
| 0.3867245370370371 | 50.01 |
| 0.3867361111111111 | 50.011 |
| 0.3867476851851852 | 50.011 |
| 0.38675925925925925 | 50.012 |
| 0.38677083333333334 | 50.012 |
| 0.3867824074074074 | 50.01 |
| 0.38679398148148153 | 50.01 |
| 0.38680555555555557 | 50.006 |